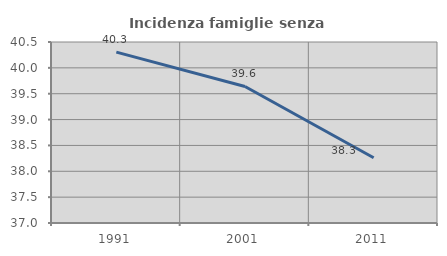
| Category | Incidenza famiglie senza nuclei |
|---|---|
| 1991.0 | 40.305 |
| 2001.0 | 39.64 |
| 2011.0 | 38.261 |